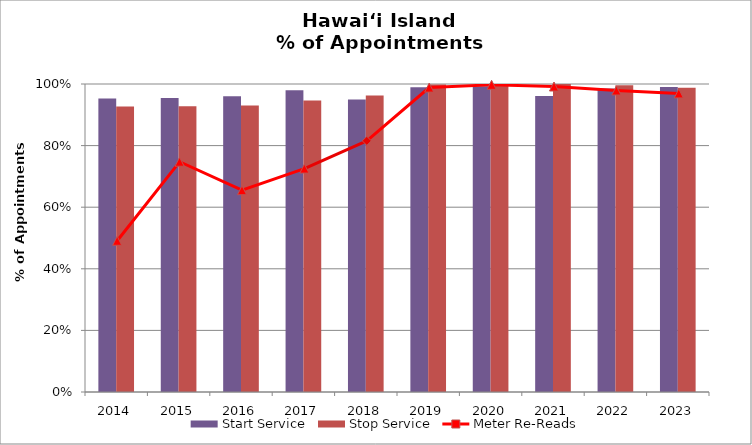
| Category | Start Service | Stop Service |
|---|---|---|
| 2014 | 0.953 | 0.927 |
| 2015 | 0.954 | 0.928 |
| 2016 | 0.96 | 0.93 |
| 2017 | 0.98 | 0.947 |
| 2018 | 0.949 | 0.962 |
| 2019 | 0.989 | 0.998 |
| 2020 | 0.993 | 0.997 |
| 2021 | 0.961 | 1 |
| 2022 | 0.985 | 0.996 |
| 2023 | 0.99 | 0.988 |